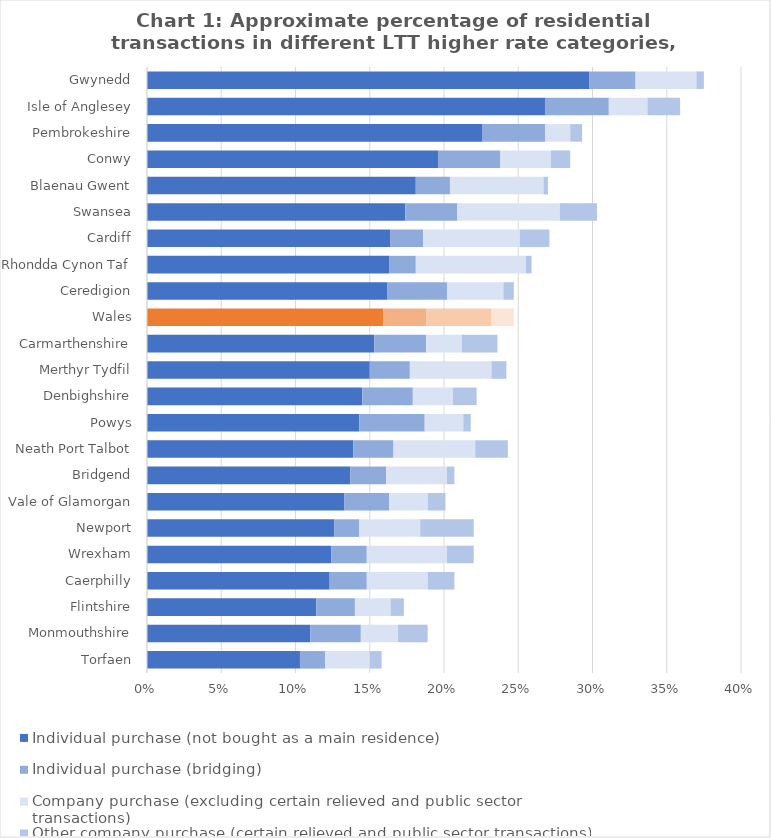
| Category | Individual purchase (not bought as a main residence) | Individual purchase (bridging) | Company purchase (excluding certain relieved and public sector transactions) | Other company purchase (certain relieved and public sector transactions) |
|---|---|---|---|---|
| Torfaen | 0.103 | 0.017 | 0.03 | 0.008 |
| Monmouthshire | 0.11 | 0.034 | 0.025 | 0.02 |
| Flintshire | 0.114 | 0.026 | 0.024 | 0.009 |
| Caerphilly | 0.123 | 0.025 | 0.041 | 0.018 |
| Wrexham | 0.124 | 0.024 | 0.054 | 0.018 |
| Newport | 0.126 | 0.017 | 0.041 | 0.036 |
| Vale of Glamorgan | 0.133 | 0.03 | 0.026 | 0.012 |
| Bridgend | 0.137 | 0.024 | 0.041 | 0.005 |
| Neath Port Talbot | 0.139 | 0.027 | 0.055 | 0.022 |
| Powys | 0.143 | 0.044 | 0.026 | 0.005 |
| Denbighshire | 0.145 | 0.034 | 0.027 | 0.016 |
| Merthyr Tydfil | 0.15 | 0.027 | 0.055 | 0.01 |
| Carmarthenshire | 0.153 | 0.035 | 0.024 | 0.024 |
| Wales | 0.159 | 0.029 | 0.044 | 0.015 |
| Ceredigion | 0.162 | 0.04 | 0.038 | 0.007 |
| Rhondda Cynon Taf | 0.163 | 0.018 | 0.074 | 0.004 |
| Cardiff | 0.164 | 0.022 | 0.065 | 0.02 |
| Swansea | 0.174 | 0.035 | 0.069 | 0.025 |
| Blaenau Gwent | 0.181 | 0.023 | 0.063 | 0.003 |
| Conwy | 0.196 | 0.042 | 0.034 | 0.013 |
| Pembrokeshire | 0.226 | 0.042 | 0.017 | 0.008 |
| Isle of Anglesey | 0.268 | 0.043 | 0.026 | 0.022 |
| Gwynedd | 0.298 | 0.031 | 0.041 | 0.005 |